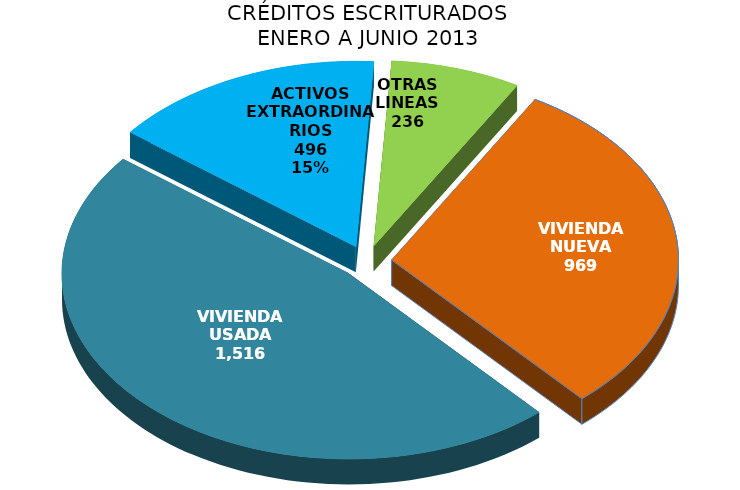
| Category | Series 0 |
|---|---|
| VIVIENDA NUEVA | 969 |
| VIVIENDA USADA | 1516 |
| ACTIVOS EXTRAORDINARIOS | 496 |
| OTRAS LINEAS | 236 |